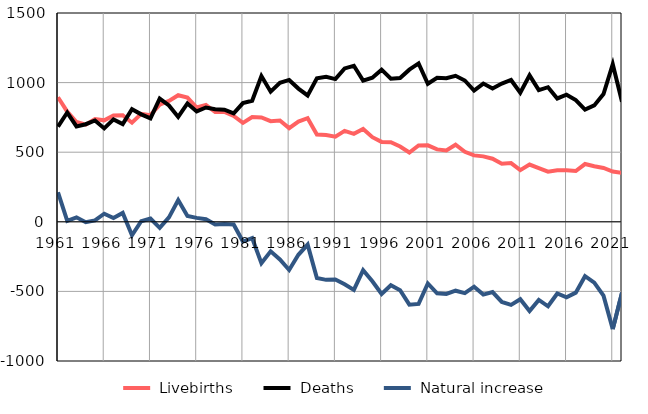
| Category |  Livebirths |  Deaths |  Natural increase |
|---|---|---|---|
| 1961.0 | 895 | 683 | 212 |
| 1962.0 | 791 | 785 | 6 |
| 1963.0 | 717 | 685 | 32 |
| 1964.0 | 698 | 701 | -3 |
| 1965.0 | 738 | 728 | 10 |
| 1966.0 | 729 | 671 | 58 |
| 1967.0 | 763 | 736 | 27 |
| 1968.0 | 766 | 702 | 64 |
| 1969.0 | 712 | 809 | -97 |
| 1970.0 | 776 | 772 | 4 |
| 1971.0 | 766 | 743 | 23 |
| 1972.0 | 841 | 885 | -44 |
| 1973.0 | 868 | 836 | 32 |
| 1974.0 | 909 | 753 | 156 |
| 1975.0 | 892 | 850 | 42 |
| 1976.0 | 821 | 793 | 28 |
| 1977.0 | 839 | 821 | 18 |
| 1978.0 | 788 | 808 | -20 |
| 1979.0 | 789 | 805 | -16 |
| 1980.0 | 760 | 779 | -19 |
| 1981.0 | 711 | 853 | -142 |
| 1982.0 | 753 | 870 | -117 |
| 1983.0 | 750 | 1047 | -297 |
| 1984.0 | 723 | 935 | -212 |
| 1985.0 | 728 | 999 | -271 |
| 1986.0 | 673 | 1019 | -346 |
| 1987.0 | 720 | 957 | -237 |
| 1988.0 | 744 | 908 | -164 |
| 1989.0 | 627 | 1031 | -404 |
| 1990.0 | 624 | 1041 | -417 |
| 1991.0 | 611 | 1025 | -414 |
| 1992.0 | 653 | 1102 | -449 |
| 1993.0 | 632 | 1121 | -489 |
| 1994.0 | 667 | 1014 | -347 |
| 1995.0 | 608 | 1035 | -427 |
| 1996.0 | 574 | 1093 | -519 |
| 1997.0 | 572 | 1028 | -456 |
| 1998.0 | 541 | 1033 | -492 |
| 1999.0 | 498 | 1093 | -595 |
| 2000.0 | 548 | 1138 | -590 |
| 2001.0 | 549 | 992 | -443 |
| 2002.0 | 520 | 1034 | -514 |
| 2003.0 | 513 | 1031 | -518 |
| 2004.0 | 554 | 1049 | -495 |
| 2005.0 | 503 | 1015 | -512 |
| 2006.0 | 477 | 943 | -466 |
| 2007.0 | 470 | 993 | -523 |
| 2008.0 | 453 | 958 | -505 |
| 2009.0 | 417 | 993 | -576 |
| 2010.0 | 422 | 1019 | -597 |
| 2011.0 | 371 | 927 | -556 |
| 2012.0 | 411 | 1052 | -641 |
| 2013.0 | 385 | 946 | -561 |
| 2014.0 | 360 | 967 | -607 |
| 2015.0 | 371 | 886 | -515 |
| 2016.0 | 370 | 913 | -543 |
| 2017.0 | 365 | 874 | -509 |
| 2018.0 | 415 | 806 | -391 |
| 2019.0 | 399 | 836 | -437 |
| 2020.0 | 387 | 918 | -531 |
| 2021.0 | 361 | 1132 | -771 |
| 2022.0 | 352 | 862 | -510 |